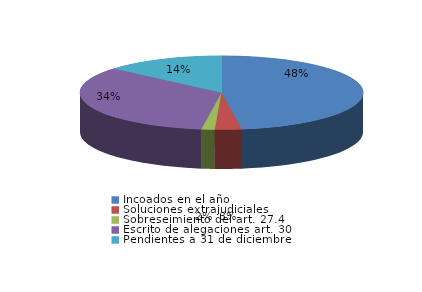
| Category | Series 0 |
|---|---|
| Incoados en el año | 63 |
| Soluciones extrajudiciales | 4 |
| Sobreseimiento del art. 27.4 | 2 |
| Escrito de alegaciones art. 30 | 45 |
| Pendientes a 31 de diciembre | 18 |